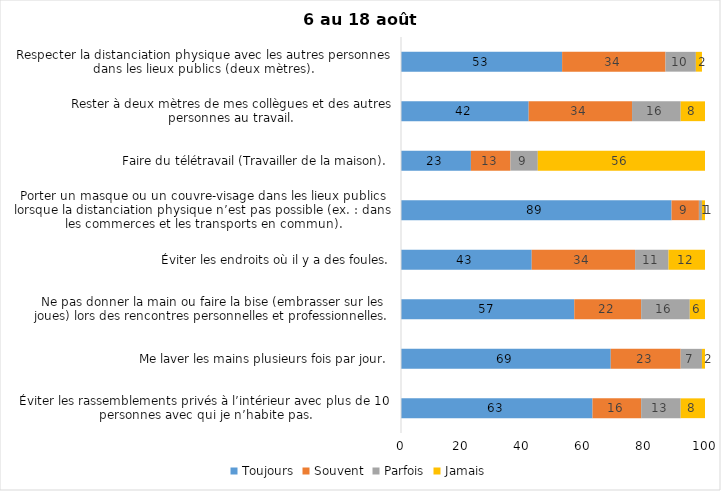
| Category | Toujours | Souvent | Parfois | Jamais |
|---|---|---|---|---|
| Éviter les rassemblements privés à l’intérieur avec plus de 10 personnes avec qui je n’habite pas. | 63 | 16 | 13 | 8 |
| Me laver les mains plusieurs fois par jour. | 69 | 23 | 7 | 2 |
| Ne pas donner la main ou faire la bise (embrasser sur les joues) lors des rencontres personnelles et professionnelles. | 57 | 22 | 16 | 6 |
| Éviter les endroits où il y a des foules. | 43 | 34 | 11 | 12 |
| Porter un masque ou un couvre-visage dans les lieux publics lorsque la distanciation physique n’est pas possible (ex. : dans les commerces et les transports en commun). | 89 | 9 | 1 | 1 |
| Faire du télétravail (Travailler de la maison). | 23 | 13 | 9 | 56 |
| Rester à deux mètres de mes collègues et des autres personnes au travail. | 42 | 34 | 16 | 8 |
| Respecter la distanciation physique avec les autres personnes dans les lieux publics (deux mètres). | 53 | 34 | 10 | 2 |